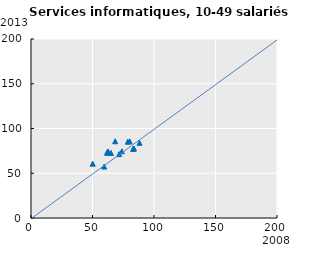
| Category | Series 0 |
|---|---|
| 62.62670265145153 | 73.04 |
| 82.98365871350157 | 77.253 |
| 50.171924815788074 | 60.676 |
| 59.50006808663584 | 57.484 |
| 88.20506689589286 | 83.987 |
| 73.8769602018354 | 74.56 |
| 78.67915684107368 | 85.261 |
| 62.527302022367124 | 74.463 |
| 65.0367555793338 | 72.702 |
| 61.739951002762446 | 72.923 |
| 80.22473009972003 | 85.64 |
| 71.66299843205917 | 71.412 |
| 68.43216894257803 | 85.753 |
| 83.74166515001404 | 77.599 |